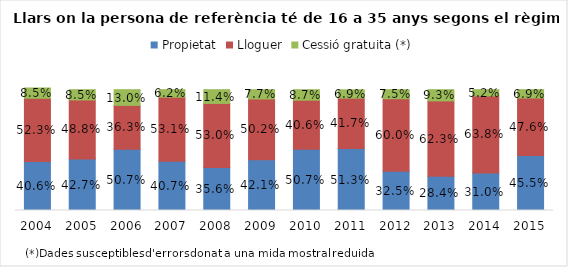
| Category | Propietat | Lloguer | Cessió gratuita (*) |
|---|---|---|---|
| 2004.0 | 0.406 | 0.523 | 0.085 |
| 2005.0 | 0.427 | 0.488 | 0.085 |
| 2006.0 | 0.507 | 0.363 | 0.13 |
| 2007.0 | 0.407 | 0.531 | 0.062 |
| 2008.0 | 0.356 | 0.53 | 0.114 |
| 2009.0 | 0.421 | 0.502 | 0.077 |
| 2010.0 | 0.507 | 0.406 | 0.087 |
| 2011.0 | 0.513 | 0.417 | 0.069 |
| 2012.0 | 0.325 | 0.6 | 0.075 |
| 2013.0 | 0.284 | 0.623 | 0.093 |
| 2014.0 | 0.31 | 0.638 | 0.052 |
| 2015.0 | 0.455 | 0.476 | 0.069 |